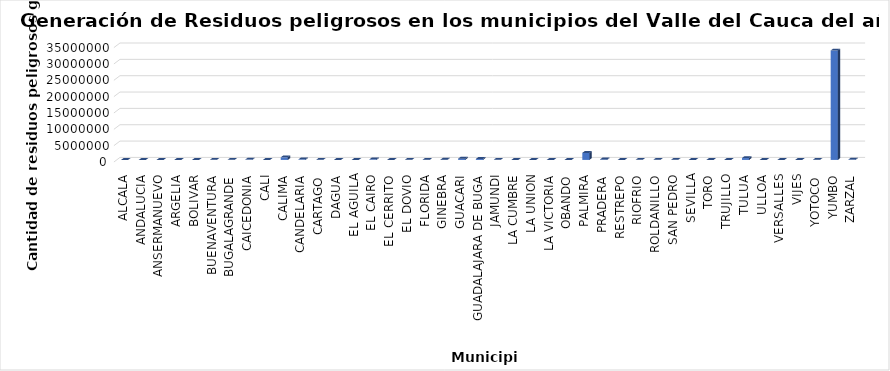
| Category | Series 0 |
|---|---|
| ALCALA | 3481.1 |
| ANDALUCIA | 4735.4 |
| ANSERMANUEVO | 5678 |
| ARGELIA | 740.5 |
| BOLIVAR | 1635.75 |
| BUENAVENTURA | 20361.1 |
| BUGALAGRANDE | 19449.1 |
| CAICEDONIA | 96119 |
| CALI | 2962 |
| CALIMA | 784986.21 |
| CANDELARIA | 177273.16 |
| CARTAGO | 46487.4 |
| DAGUA | 1009 |
| EL AGUILA | 946 |
| EL CAIRO | 183984.18 |
| EL CERRITO | 2380 |
| EL DOVIO | 38991.67 |
| FLORIDA | 55976.52 |
| GINEBRA | 74208.38 |
| GUACARI | 390303.45 |
| GUADALAJARA DE BUGA | 298301.06 |
| JAMUNDI | 25598.47 |
| LA CUMBRE | 2670.02 |
| LA UNION | 11086.2 |
| LA VICTORIA | 13037 |
| OBANDO | 3968 |
| PALMIRA | 2147080.91 |
| PRADERA | 145988.81 |
| RESTREPO | 9075 |
| RIOFRIO | 13535.08 |
| ROLDANILLO | 24173.64 |
| SAN PEDRO | 36399.13 |
| SEVILLA | 4503.28 |
| TORO | 1982 |
| TRUJILLO | 3340.25 |
| TULUA | 572866.96 |
| ULLOA | 654.5 |
| VERSALLES | 1497.5 |
| VIJES | 1857.64 |
| YOTOCO | 49917.92 |
| YUMBO | 33466644.18 |
| ZARZAL | 128222.85 |